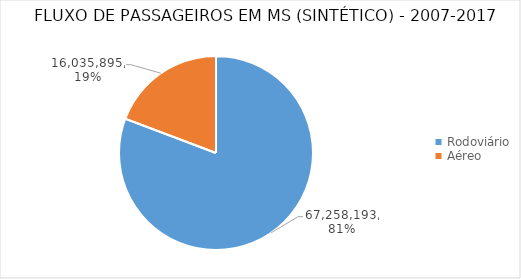
| Category | Series 0 |
|---|---|
| Rodoviário | 67258192.899 |
| Aéreo | 16035895 |